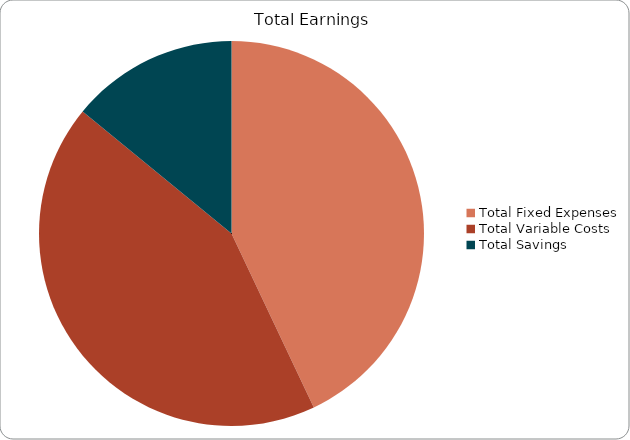
| Category | Series 0 |
|---|---|
| Total Fixed Expenses | 1680 |
| Total Variable Costs  | 1680 |
| Total Savings | 550 |